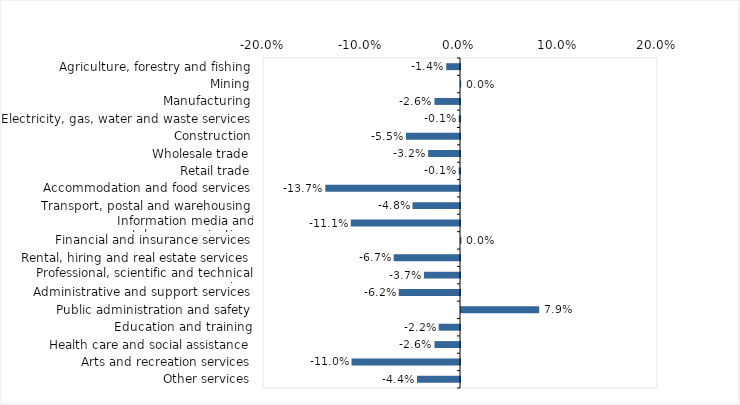
| Category | This week |
|---|---|
| Agriculture, forestry and fishing | -0.014 |
| Mining | 0 |
| Manufacturing | -0.026 |
| Electricity, gas, water and waste services | -0.001 |
| Construction | -0.055 |
| Wholesale trade | -0.032 |
| Retail trade | -0.001 |
| Accommodation and food services | -0.137 |
| Transport, postal and warehousing | -0.048 |
| Information media and telecommunications | -0.111 |
| Financial and insurance services | 0 |
| Rental, hiring and real estate services | -0.067 |
| Professional, scientific and technical services | -0.037 |
| Administrative and support services | -0.062 |
| Public administration and safety | 0.079 |
| Education and training | -0.022 |
| Health care and social assistance | -0.026 |
| Arts and recreation services | -0.11 |
| Other services | -0.044 |